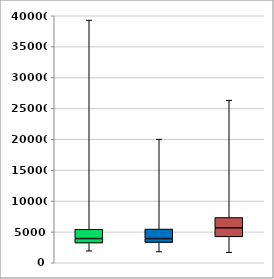
| Category | Series 0 | Series 1 | Series 2 | Series 3 |
|---|---|---|---|---|
| 0 | 1943.432 | 1249.556 | 726.517 | 1506.184 |
| 1 | 1816.815 | 1460.419 | 635.875 | 1548.502 |
| 2 | 1696.357 | 2504.369 | 1466.155 | 1663.009 |